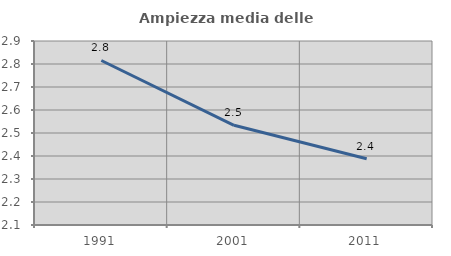
| Category | Ampiezza media delle famiglie |
|---|---|
| 1991.0 | 2.815 |
| 2001.0 | 2.533 |
| 2011.0 | 2.388 |